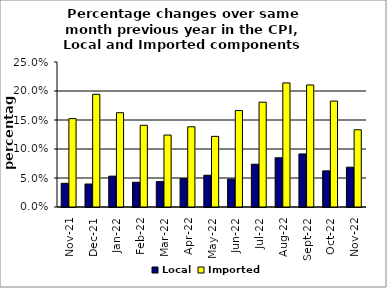
| Category | Local | Imported |
|---|---|---|
| 2021-11-01 | 0.041 | 0.152 |
| 2021-12-01 | 0.04 | 0.194 |
| 2022-01-01 | 0.053 | 0.163 |
| 2022-02-01 | 0.043 | 0.141 |
| 2022-03-01 | 0.044 | 0.124 |
| 2022-04-01 | 0.049 | 0.138 |
| 2022-05-01 | 0.055 | 0.122 |
| 2022-06-01 | 0.048 | 0.166 |
| 2022-07-01 | 0.074 | 0.181 |
| 2022-08-01 | 0.085 | 0.214 |
| 2022-09-01 | 0.091 | 0.21 |
| 2022-10-01 | 0.062 | 0.183 |
| 2022-11-01 | 0.069 | 0.133 |